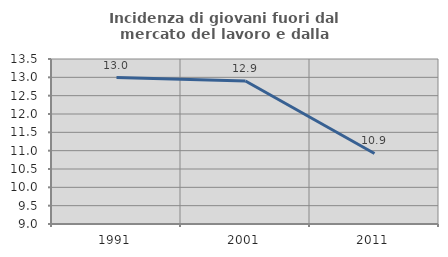
| Category | Incidenza di giovani fuori dal mercato del lavoro e dalla formazione  |
|---|---|
| 1991.0 | 12.992 |
| 2001.0 | 12.9 |
| 2011.0 | 10.924 |